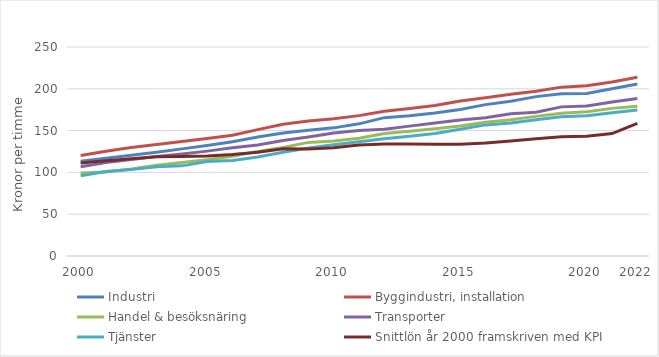
| Category | Industri | Byggindustri, installation | Handel & besöksnäring | Transporter | Tjänster | Snittlön år 2000 framskriven med KPI |
|---|---|---|---|---|---|---|
| 2000.0 | 113.46 | 120.2 | 99.16 | 106.82 | 95.92 | 111.26 |
| nan | 116.86 | 125.39 | 100.54 | 111.7 | 100.95 | 113.991 |
| nan | 120.54 | 129.69 | 104.04 | 115.28 | 103.33 | 116.424 |
| nan | 124.22 | 133.31 | 108.44 | 118.98 | 106.64 | 118.686 |
| nan | 128.15 | 136.89 | 111.91 | 121.97 | 107.82 | 119.155 |
| 2005.0 | 132.12 | 140.56 | 115.27 | 125.46 | 113.14 | 119.667 |
| nan | 136.66 | 144.54 | 119.28 | 129.55 | 114.32 | 121.298 |
| nan | 142.3 | 151.19 | 125.13 | 132.74 | 118.31 | 123.982 |
| nan | 147.23 | 157.51 | 129.71 | 138.24 | 124.08 | 128.293 |
| nan | 150.54 | 161.4 | 135.89 | 142.3 | 129.3 | 127.887 |
| 2010.0 | 153.28 | 164.25 | 137.66 | 147.03 | 133.08 | 129.509 |
| nan | 158.09 | 167.9 | 140.89 | 150.11 | 136.65 | 132.91 |
| nan | 165.47 | 173.2 | 146.6 | 151.5 | 140.19 | 134.092 |
| nan | 167.7 | 176.32 | 149.09 | 155.34 | 143.12 | 134.033 |
| nan | 171.15 | 179.91 | 152.16 | 159.05 | 146.55 | 133.789 |
| 2015.0 | 175.32 | 185.34 | 155.56 | 162.8 | 151.56 | 133.73 |
| nan | 181.07 | 189.38 | 159.96 | 165.46 | 156.83 | 135.044 |
| nan | 185.15 | 193.43 | 162.95 | 170.11 | 159.11 | 137.467 |
| nan | 190.64 | 197.01 | 167.03 | 172.08 | 163 | 140.153 |
| nan | 193.96 | 202 | 170.64 | 178.38 | 166.59 | 142.654 |
| 2020.0 | 194.28 | 203.67 | 172.54 | 179.54 | 167.83 | 143.362 |
| nan | 200.01 | 208.2 | 176.59 | 184.18 | 171.34 | 146.464 |
| 2022.0 | 205.84 | 213.83 | 179.23 | 188.36 | 174.62 | 158.722 |